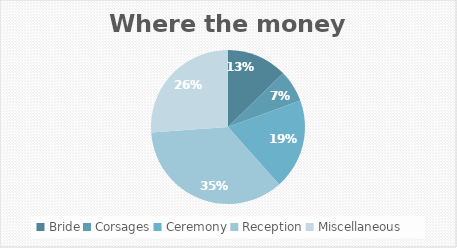
| Category | Amount |
|---|---|
| Bride | 170 |
| Corsages | 90 |
| Ceremony | 255 |
| Reception | 475 |
| Miscellaneous | 350 |